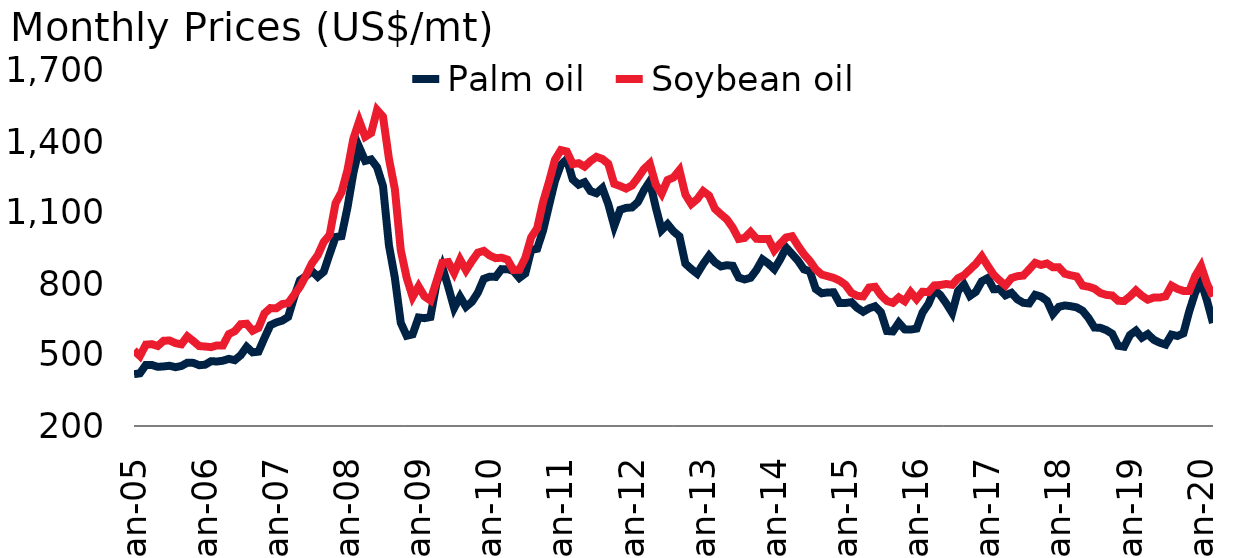
| Category | Palm oil | Soybean oil |
|---|---|---|
| 2005-01-01 | 418.86 | 519.98 |
| 2005-02-01 | 422.63 | 495.73 |
| 2005-03-01 | 458.13 | 543.69 |
| 2005-04-01 | 457.86 | 545.88 |
| 2005-05-01 | 450 | 537.98 |
| 2005-06-01 | 451.7 | 560.15 |
| 2005-07-01 | 454.52 | 561.26 |
| 2005-08-01 | 448.48 | 550.08 |
| 2005-09-01 | 453.64 | 545.16 |
| 2005-10-01 | 467.5 | 578.62 |
| 2005-11-01 | 466.7 | 558.93 |
| 2005-12-01 | 456.75 | 537.66 |
| 2006-01-01 | 459.05 | 535.83 |
| 2006-02-01 | 473.9 | 533.27 |
| 2006-03-01 | 472.52 | 540.6 |
| 2006-04-01 | 475.9 | 540.44 |
| 2006-05-01 | 483.72 | 588.29 |
| 2006-06-01 | 478.16 | 600.55 |
| 2006-07-01 | 499.21 | 630.01 |
| 2006-08-01 | 534.26 | 632.18 |
| 2006-09-01 | 511.24 | 602.35 |
| 2006-10-01 | 514.18 | 614.71 |
| 2006-11-01 | 571.57 | 675.67 |
| 2006-12-01 | 625.88 | 698.12 |
| 2007-01-01 | 637.59 | 697.33 |
| 2007-02-01 | 645.2 | 715.04 |
| 2007-03-01 | 660.93 | 719.03 |
| 2007-04-01 | 743.45 | 753.7 |
| 2007-05-01 | 816.09 | 788.7 |
| 2007-06-01 | 833.19 | 835.55 |
| 2007-07-01 | 854.52 | 887.12 |
| 2007-08-01 | 830.65 | 921.79 |
| 2007-09-01 | 851.63 | 977.48 |
| 2007-10-01 | 926.2 | 1007.69 |
| 2007-11-01 | 998.57 | 1141.52 |
| 2007-12-01 | 1002.22 | 1187.73 |
| 2008-01-01 | 1122.15 | 1280.2 |
| 2008-02-01 | 1268.63 | 1414.17 |
| 2008-03-01 | 1377.22 | 1488.74 |
| 2008-04-01 | 1320.11 | 1422.23 |
| 2008-05-01 | 1326.45 | 1437.87 |
| 2008-06-01 | 1293.21 | 1535.16 |
| 2008-07-01 | 1213.48 | 1506.98 |
| 2008-08-01 | 963.57 | 1329.64 |
| 2008-09-01 | 826.02 | 1201.02 |
| 2008-10-01 | 635.75 | 942.53 |
| 2008-11-01 | 581.25 | 825.64 |
| 2008-12-01 | 587.24 | 745.55 |
| 2009-01-01 | 658.55 | 789.89 |
| 2009-02-01 | 655.66 | 747.64 |
| 2009-03-01 | 660.48 | 730.71 |
| 2009-04-01 | 799.7 | 809.08 |
| 2009-05-01 | 872.61 | 889.62 |
| 2009-06-01 | 788.57 | 892.92 |
| 2009-07-01 | 698.48 | 846.3 |
| 2009-08-01 | 746.05 | 903.15 |
| 2009-09-01 | 703.85 | 858.18 |
| 2009-10-01 | 724.66 | 897 |
| 2009-11-01 | 763.33 | 932.38 |
| 2009-12-01 | 821.81 | 939.91 |
| 2010-01-01 | 830.88 | 920.55 |
| 2010-02-01 | 830 | 909.19 |
| 2010-03-01 | 862.83 | 911.07 |
| 2010-04-01 | 862.71 | 902.83 |
| 2010-05-01 | 855.31 | 859.49 |
| 2010-06-01 | 825.68 | 860.28 |
| 2010-07-01 | 844.43 | 910.82 |
| 2010-08-01 | 943.73 | 997.62 |
| 2010-09-01 | 948.88 | 1035.26 |
| 2010-10-01 | 1025.83 | 1146.75 |
| 2010-11-01 | 1131.36 | 1231.69 |
| 2010-12-01 | 1234.64 | 1324.72 |
| 2011-01-01 | 1303.57 | 1365.73 |
| 2011-02-01 | 1327.21 | 1359.86 |
| 2011-03-01 | 1241.74 | 1306.53 |
| 2011-04-01 | 1219.61 | 1310.45 |
| 2011-05-01 | 1230.12 | 1296.03 |
| 2011-06-01 | 1192.38 | 1319.38 |
| 2011-07-01 | 1183.45 | 1337.36 |
| 2011-08-01 | 1205.48 | 1328.39 |
| 2011-09-01 | 1137.25 | 1307.85 |
| 2011-10-01 | 1044.75 | 1223.1 |
| 2011-11-01 | 1113.38 | 1213.96 |
| 2011-12-01 | 1121.5 | 1203.28 |
| 2012-01-01 | 1123.5 | 1216.28 |
| 2012-02-01 | 1146.25 | 1249.12 |
| 2012-03-01 | 1195.34 | 1285.38 |
| 2012-04-01 | 1233.61 | 1308.89 |
| 2012-05-01 | 1125 | 1220.55 |
| 2012-06-01 | 1027.74 | 1181.93 |
| 2012-07-01 | 1052.84 | 1239.49 |
| 2012-08-01 | 1022.38 | 1250.27 |
| 2012-09-01 | 1001.38 | 1280.95 |
| 2012-10-01 | 886 | 1177.95 |
| 2012-11-01 | 863.18 | 1137.78 |
| 2012-12-01 | 843.55 | 1158.64 |
| 2013-01-01 | 884.52 | 1192.35 |
| 2013-02-01 | 919.58 | 1173.48 |
| 2013-03-01 | 891.5 | 1117.43 |
| 2013-04-01 | 874.17 | 1094.52 |
| 2013-05-01 | 879.47 | 1073.2 |
| 2013-06-01 | 876.88 | 1037.75 |
| 2013-07-01 | 827.09 | 990.31 |
| 2013-08-01 | 819.29 | 994.65 |
| 2013-09-01 | 826.25 | 1019.72 |
| 2013-10-01 | 859.66 | 990.96 |
| 2013-11-01 | 904.05 | 989.83 |
| 2013-12-01 | 886.25 | 990.52 |
| 2014-01-01 | 862.63 | 942.1 |
| 2014-02-01 | 904.34 | 970.96 |
| 2014-03-01 | 953.81 | 996.67 |
| 2014-04-01 | 926.63 | 1001.69 |
| 2014-05-01 | 898.42 | 961.81 |
| 2014-06-01 | 861.88 | 925.82 |
| 2014-07-01 | 853.69 | 897.43 |
| 2014-08-01 | 778.69 | 861.77 |
| 2014-09-01 | 760.75 | 839.82 |
| 2014-10-01 | 764.4 | 833.03 |
| 2014-11-01 | 764.75 | 825.98 |
| 2014-12-01 | 719.64 | 814.55 |
| 2015-01-01 | 719.64 | 796.58 |
| 2015-02-01 | 723.04 | 762.61 |
| 2015-03-01 | 698.86 | 749.93 |
| 2015-04-01 | 682.75 | 747.74 |
| 2015-05-01 | 697.35 | 785.13 |
| 2015-06-01 | 705.91 | 788.21 |
| 2015-07-01 | 680 | 752.32 |
| 2015-08-01 | 601.38 | 728.33 |
| 2015-09-01 | 599.5 | 720.4 |
| 2015-10-01 | 636.67 | 743.3 |
| 2015-11-01 | 608.21 | 727.34 |
| 2015-12-01 | 607.38 | 765.7 |
| 2016-01-01 | 611.63 | 736.03 |
| 2016-02-01 | 679.17 | 767.24 |
| 2016-03-01 | 715.95 | 765.61 |
| 2016-04-01 | 775 | 794.13 |
| 2016-05-01 | 753.42 | 795.64 |
| 2016-06-01 | 718.18 | 799.91 |
| 2016-07-01 | 678.16 | 796.67 |
| 2016-08-01 | 771.02 | 824.42 |
| 2016-09-01 | 797.85 | 837.21 |
| 2016-10-01 | 749.75 | 861.26 |
| 2016-11-01 | 766.93 | 885.11 |
| 2016-12-01 | 811.38 | 916.7 |
| 2017-01-01 | 825 | 876.85 |
| 2017-02-01 | 777.81 | 839.6 |
| 2017-03-01 | 778.7 | 814.94 |
| 2017-04-01 | 752.06 | 794.04 |
| 2017-05-01 | 762.75 | 825.06 |
| 2017-06-01 | 735.14 | 832.95 |
| 2017-07-01 | 720.48 | 835.6 |
| 2017-08-01 | 717.95 | 861.72 |
| 2017-09-01 | 754.25 | 889.44 |
| 2017-10-01 | 746.79 | 880.6 |
| 2017-11-01 | 728.86 | 886.77 |
| 2017-12-01 | 673.75 | 870.45 |
| 2018-01-01 | 703.45 | 870.5 |
| 2018-02-01 | 709.44 | 843.56 |
| 2018-03-01 | 706.19 | 836.68 |
| 2018-04-01 | 701.18 | 831.85 |
| 2018-05-01 | 687.15 | 793.25 |
| 2018-06-01 | 656.5 | 788.57 |
| 2018-07-01 | 616.14 | 780.45 |
| 2018-08-01 | 614.75 | 761.82 |
| 2018-09-01 | 605.15 | 754.05 |
| 2018-10-01 | 589.8 | 751.58 |
| 2018-11-01 | 539.1 | 729.22 |
| 2018-12-01 | 535.02 | 727.88 |
| 2019-01-01 | 584.58 | 747.79 |
| 2019-02-01 | 602.97 | 772.82 |
| 2019-03-01 | 573.02 | 750.33 |
| 2019-04-01 | 588.45 | 733.77 |
| 2019-05-01 | 564.4 | 742.53 |
| 2019-06-01 | 552.19 | 742.89 |
| 2019-07-01 | 543.88 | 748.17 |
| 2019-08-01 | 586.12 | 793.21 |
| 2019-09-01 | 580.3 | 779.25 |
| 2019-10-01 | 591.35 | 770.8 |
| 2019-11-01 | 685.41 | 770.2 |
| 2019-12-01 | 763.73 | 833.52 |
| 2020-01-01 | 810.07 | 875.64 |
| 2020-02-01 | 728.81 | 800.41 |
| 2020-03-01 | 635.19 | 747.75 |